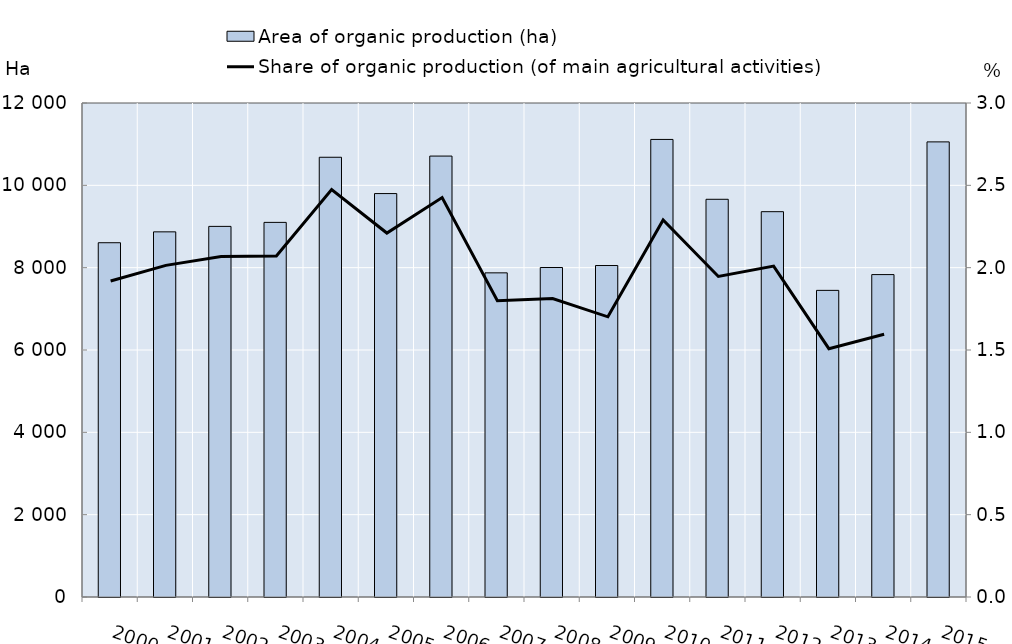
| Category | Area of organic production (ha) |
|---|---|
| 2000.0 | 8606 |
| 2001.0 | 8870 |
| 2002.0 | 9003 |
| 2003.0 | 9100 |
| 2004.0 | 10682 |
| 2005.0 | 9800 |
| 2006.0 | 10711 |
| 2007.0 | 7874 |
| 2008.0 | 8004 |
| 2009.0 | 8052 |
| 2010.0 | 11115 |
| 2011.0 | 9661.1 |
| 2012.0 | 9360 |
| 2013.0 | 7448.6 |
| 2014.0 | 7832 |
| 2015.0 | 11055.5 |